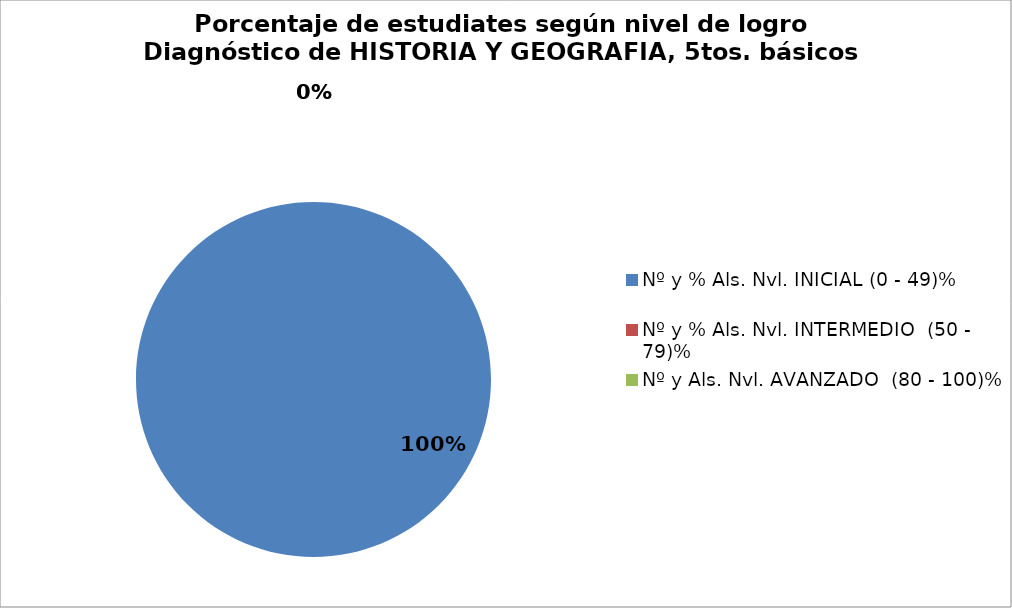
| Category | Series 0 |
|---|---|
| Nº y % Als. Nvl. INICIAL (0 - 49)% | 1 |
| Nº y % Als. Nvl. INTERMEDIO  (50 - 79)% | 0 |
| Nº y Als. Nvl. AVANZADO  (80 - 100)% | 0 |